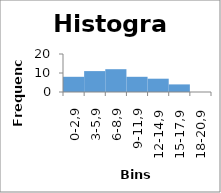
| Category | Frequency |
|---|---|
| 0-2,9 | 8 |
| 3-5,9 | 11 |
| 6-8,9 | 12 |
| 9-11,9 | 8 |
| 12-14,9 | 7 |
| 15-17,9 | 4 |
| 18-20,9 | 0 |